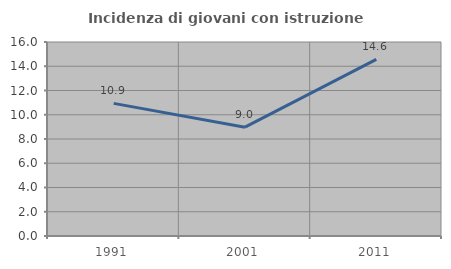
| Category | Incidenza di giovani con istruzione universitaria |
|---|---|
| 1991.0 | 10.938 |
| 2001.0 | 8.974 |
| 2011.0 | 14.563 |